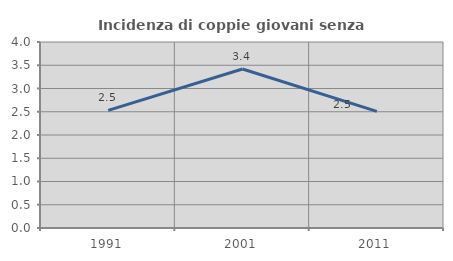
| Category | Incidenza di coppie giovani senza figli |
|---|---|
| 1991.0 | 2.531 |
| 2001.0 | 3.421 |
| 2011.0 | 2.507 |